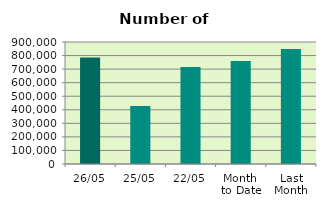
| Category | Series 0 |
|---|---|
| 26/05 | 785822 |
| 25/05 | 427998 |
| 22/05 | 715164 |
| Month 
to Date | 760547.529 |
| Last
Month | 848119.7 |